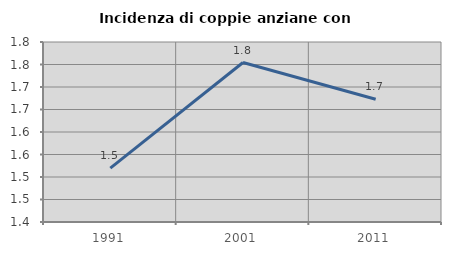
| Category | Incidenza di coppie anziane con figli |
|---|---|
| 1991.0 | 1.52 |
| 2001.0 | 1.754 |
| 2011.0 | 1.673 |